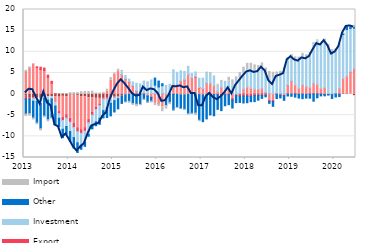
| Category | Transaction accounts | Liquidity and current assets | Export | Investment | Other | Import |
|---|---|---|---|---|---|---|
| 2013-01-01 | -0.509 | 5.466 | -0.655 | 0.157 | -3.557 | -0.62 |
| 2013-02-01 | -0.821 | 6.307 | -0.351 | 0.101 | -3.442 | -0.636 |
| 2013-03-01 | -0.908 | 7.144 | -0.174 | -0.604 | -3.955 | -0.473 |
| 2013-04-01 | -0.906 | 6.265 | 0.188 | -0.805 | -5.11 | -0.441 |
| 2013-05-01 | -1.028 | 5.791 | 0.566 | -1.205 | -5.942 | -0.539 |
| 2013-06-01 | -0.715 | 5.566 | 0.59 | -0.246 | -4.209 | -0.467 |
| 2013-07-01 | -0.656 | 3.962 | 0.527 | -0.788 | -4.619 | -0.522 |
| 2013-08-01 | -0.571 | 2.543 | 0.475 | -0.574 | -4.455 | -0.211 |
| 2013-09-01 | -0.597 | -1.463 | 0.046 | -0.788 | -4.325 | -0.17 |
| 2013-10-01 | -0.731 | -3.405 | -0.479 | -1.101 | -1.998 | -0.034 |
| 2013-11-01 | -0.534 | -5.012 | -0.697 | -2.071 | -1.999 | 0.032 |
| 2013-12-01 | -0.631 | -4.25 | -0.793 | -2 | -1.812 | 0.042 |
| 2014-01-01 | -0.248 | -5.468 | -0.921 | -2.223 | -2.314 | 0.338 |
| 2014-02-01 | -0.244 | -6.677 | -0.967 | -2.397 | -2.478 | 0.345 |
| 2014-03-01 | -0.312 | -7.664 | -0.914 | -2.634 | -2.299 | 0.368 |
| 2014-04-01 | -0.598 | -7.82 | -0.878 | -2.779 | -0.977 | 0.561 |
| 2014-05-01 | -0.678 | -7.271 | -0.835 | -2.63 | -0.953 | 0.634 |
| 2014-06-01 | -0.89 | -5.133 | -0.763 | -2.735 | -0.458 | 0.61 |
| 2014-07-01 | -0.861 | -3.427 | -0.672 | -2.518 | -0.758 | 0.681 |
| 2014-08-01 | -1.004 | -2.174 | -0.467 | -2.918 | -0.917 | 0.276 |
| 2014-09-01 | -1.021 | -1.308 | -0.375 | -3.018 | -1.426 | 0.243 |
| 2014-10-01 | -0.819 | 0.161 | -0.34 | -2.752 | -1.718 | 0.247 |
| 2014-11-01 | -0.858 | 0.695 | -0.279 | -2.093 | -2.317 | 0.459 |
| 2014-12-01 | -0.577 | 3.263 | -0.264 | -1.35 | -2.967 | 0.625 |
| 2015-01-01 | -0.712 | 4.673 | -0.142 | -0.704 | -2.68 | 0.34 |
| 2015-02-01 | -0.565 | 5.321 | -0.111 | -0.407 | -2.409 | 0.553 |
| 2015-03-01 | -0.434 | 4.59 | 0.008 | 0.669 | -1.773 | 0.324 |
| 2015-04-01 | -0.175 | 3.498 | 0.044 | 0.845 | -1.638 | -0.132 |
| 2015-05-01 | -0.054 | 2.82 | 0.068 | 0.654 | -1.651 | -0.488 |
| 2015-06-01 | 0.05 | 1.84 | 0.063 | 0.904 | -2.258 | -0.459 |
| 2015-07-01 | 0.129 | 0.502 | 0.07 | 1.849 | -2.403 | -0.592 |
| 2015-08-01 | 0.104 | 0.009 | -0.067 | 2.291 | -2.376 | -0.307 |
| 2015-09-01 | 0.112 | 0.208 | -0.055 | 2.751 | -1.148 | -0.214 |
| 2015-10-01 | 0.038 | -0.411 | -0.06 | 2.883 | -1.421 | -0.215 |
| 2015-11-01 | 0.131 | -0.703 | -0.076 | 3.2 | -0.895 | -0.44 |
| 2015-12-01 | 0.06 | -2.198 | 0.008 | 2.045 | 1.664 | -0.542 |
| 2016-01-01 | 0.112 | -2.269 | -0.03 | 1.566 | 1.404 | -0.65 |
| 2016-02-01 | 0.086 | -3.097 | 0.005 | 1.894 | 0.462 | -1.069 |
| 2016-03-01 | 0.054 | -1.187 | -0.022 | 1.97 | -1.494 | -0.878 |
| 2016-04-01 | 0.002 | 0.259 | -0.024 | 2.055 | -1.952 | -0.542 |
| 2016-05-01 | -0.049 | 2.232 | -0.014 | 3.525 | -3.719 | -0.201 |
| 2016-06-01 | -0.049 | 2.038 | 0.004 | 3.11 | -3.101 | -0.262 |
| 2016-07-01 | -0.188 | 3.046 | 0.004 | 2.456 | -3.237 | -0.159 |
| 2016-08-01 | -0.222 | 3.353 | 0.003 | 1.994 | -3.361 | -0.259 |
| 2016-09-01 | -0.107 | 4.637 | 0.003 | 1.923 | -4.549 | -0.209 |
| 2016-10-01 | -0.069 | 3.752 | 0.02 | 1.099 | -4.471 | -0.197 |
| 2016-11-01 | 0.003 | 4.032 | 0.118 | 1.076 | -4.499 | -0.6 |
| 2016-12-01 | -0.126 | 1.493 | 0.07 | 2.199 | -6.059 | -0.332 |
| 2017-01-01 | -0.287 | 1.255 | 0.034 | 2.468 | -6.239 | 0.016 |
| 2017-02-01 | -0.028 | 2.502 | 0.033 | 2.337 | -5.845 | 0.328 |
| 2017-03-01 | -0.212 | 2.639 | -0.061 | 2.218 | -4.66 | 0.242 |
| 2017-04-01 | 0.006 | 1.986 | -0.118 | 2.178 | -5.005 | 0.123 |
| 2017-05-01 | -0.021 | 0.622 | -0.131 | 1.488 | -3.457 | 0.202 |
| 2017-06-01 | -0.058 | 1.637 | -0.146 | 1.1 | -3.715 | 0.504 |
| 2017-07-01 | 0.066 | 0.742 | -0.146 | 1.936 | -2.615 | 0.257 |
| 2017-08-01 | 0.095 | 1.091 | -0.147 | 1.891 | -2.348 | 0.891 |
| 2017-09-01 | -0.033 | -1.003 | -0.338 | 2.229 | -1.931 | 1.128 |
| 2017-10-01 | 0.035 | -0.002 | -0.349 | 2.95 | -1.675 | 1.076 |
| 2017-11-01 | -0.038 | 0.191 | -0.423 | 3.298 | -1.519 | 1.614 |
| 2017-12-01 | 0.111 | 1.115 | -0.472 | 3.68 | -1.636 | 1.452 |
| 2018-01-01 | -0.017 | 1.678 | -0.449 | 4.093 | -1.582 | 1.485 |
| 2018-02-01 | -0.076 | 1.395 | -0.446 | 4.432 | -1.275 | 1.464 |
| 2018-03-01 | 0.181 | 0.968 | -0.353 | 4.465 | -1.426 | 1.286 |
| 2018-04-01 | 0.071 | 1.103 | -0.297 | 4.181 | -1.141 | 1.381 |
| 2018-05-01 | 0.137 | 1.251 | -0.296 | 4.4 | -0.726 | 1.574 |
| 2018-06-01 | 0.284 | 0.134 | -0.277 | 4.559 | -0.377 | 1.191 |
| 2018-07-01 | 0.145 | -1.444 | -0.282 | 3.523 | -0.476 | 1.691 |
| 2018-08-01 | 0.047 | -1.482 | -0.277 | 3.826 | -1.138 | 1.281 |
| 2018-09-01 | 0.187 | 0.07 | -0.088 | 3.999 | -0.981 | 0.962 |
| 2018-10-01 | 0.165 | -0.154 | -0.086 | 4.312 | -0.67 | 0.902 |
| 2018-11-01 | 0.151 | -0.294 | -0.083 | 5.778 | -1.1 | 0.383 |
| 2018-12-01 | 0.121 | 2.002 | 0.005 | 5.72 | -0.449 | 0.69 |
| 2019-01-01 | 0.084 | 2.964 | 0.003 | 5.799 | -0.532 | 0.511 |
| 2019-02-01 | 0.122 | 2.071 | -0.001 | 6.112 | -0.71 | 0.483 |
| 2019-03-01 | -0.043 | 1.384 | -0.007 | 6.432 | -0.89 | 0.926 |
| 2019-04-01 | -0.017 | 2.209 | -0.007 | 6.458 | -1.061 | 0.975 |
| 2019-05-01 | -0.065 | 1.864 | -0.007 | 6.82 | -0.881 | 0.597 |
| 2019-06-01 | 0.071 | 1.52 | -0.011 | 7.649 | -0.954 | 0.599 |
| 2019-07-01 | 0.174 | 2.439 | -0.011 | 8.965 | -1.672 | 0.577 |
| 2019-08-01 | 0.114 | 2.222 | -0.011 | 10.233 | -0.877 | 0.238 |
| 2019-09-01 | 0.013 | 1.329 | -0.011 | 10.479 | -0.423 | 0.206 |
| 2019-10-31 | -0.066 | 1.541 | -0.01 | 11.047 | -0.342 | 0.436 |
| 2019-11-30 | -0.091 | 0.084 | -0.01 | 10.759 | -0.137 | 0.843 |
| 2019-12-31 | -0.112 | -0.022 | -0.01 | 10.098 | -0.896 | 0.408 |
| 2020-01-31 | 0.054 | 0.141 | -0.01 | 9.923 | -0.677 | 0.532 |
| 2020-02-29 | -0.038 | 1.384 | -0.005 | 9.987 | -0.557 | 0.483 |
| 2020-03-31 | 0.142 | 3.609 | 0 | 10.341 | 0.142 | 0.224 |
| 2020-04-30 | 0.16 | 4.087 | 0 | 11.041 | 0.559 | 0.149 |
| 2020-05-31 | -0.034 | 5.187 | 0.005 | 10.338 | 0.308 | 0.306 |
| 2020-06-30 | -0.38 | 6.042 | 0.022 | 9.534 | 0.223 | 0.414 |